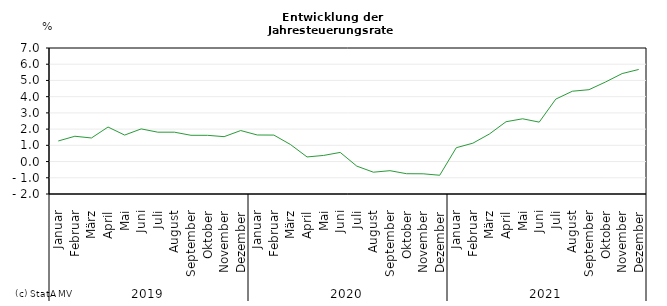
| Category | Series 0 |
|---|---|
| 0 | 1.268 |
| 1 | 1.559 |
| 2 | 1.453 |
| 3 | 2.128 |
| 4 | 1.633 |
| 5 | 2.013 |
| 6 | 1.811 |
| 7 | 1.811 |
| 8 | 1.619 |
| 9 | 1.618 |
| 10 | 1.534 |
| 11 | 1.912 |
| 12 | 1.638 |
| 13 | 1.631 |
| 14 | 1.051 |
| 15 | 0.284 |
| 16 | 0.378 |
| 17 | 0.564 |
| 18 | -0.281 |
| 19 | -0.655 |
| 20 | -0.562 |
| 21 | -0.749 |
| 22 | -0.755 |
| 23 | -0.844 |
| 24 | 0.853 |
| 25 | 1.133 |
| 26 | 1.701 |
| 27 | 2.455 |
| 28 | 2.637 |
| 29 | 2.43 |
| 30 | 3.85 |
| 31 | 4.336 |
| 32 | 4.43 |
| 33 | 4.906 |
| 34 | 5.423 |
| 35 | 5.676 |